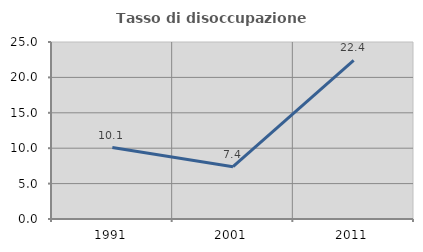
| Category | Tasso di disoccupazione giovanile  |
|---|---|
| 1991.0 | 10.096 |
| 2001.0 | 7.386 |
| 2011.0 | 22.402 |